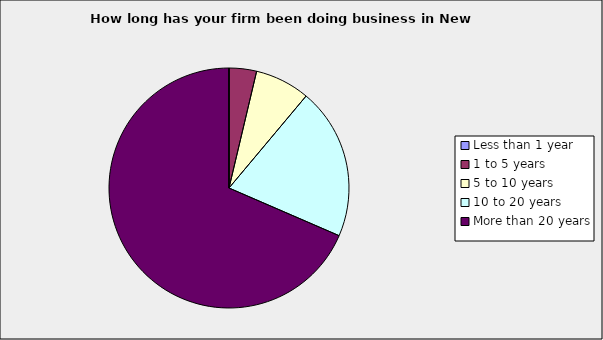
| Category | Series 0 |
|---|---|
| Less than 1 year | 0 |
| 1 to 5 years | 0.037 |
| 5 to 10 years | 0.074 |
| 10 to 20 years | 0.204 |
| More than 20 years | 0.685 |